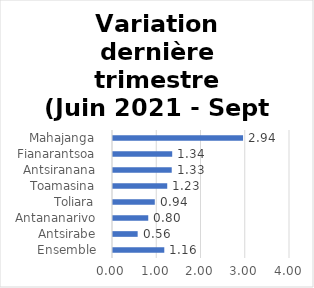
| Category | Variation dernière trimestre |
|---|---|
|  Ensemble  | 1.159 |
|  Antsirabe  | 0.557 |
|  Antananarivo  | 0.796 |
|  Toliara  | 0.945 |
|  Toamasina  | 1.226 |
|  Antsiranana  | 1.327 |
|  Fianarantsoa  | 1.338 |
|  Mahajanga  | 2.939 |